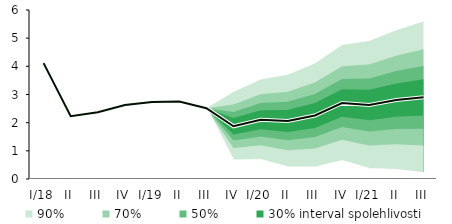
| Category | linka | Střed předpovědi |
|---|---|---|
| I/18 | 4.113 | 4.113 |
| II | 2.229 | 2.229 |
| III | 2.369 | 2.369 |
| IV | 2.63 | 2.63 |
| I/19 | 2.732 | 2.732 |
| II | 2.75 | 2.75 |
| III | 2.514 | 2.514 |
| IV | 1.872 | 1.872 |
| I/20 | 2.105 | 2.105 |
| II | 2.06 | 2.06 |
| III | 2.254 | 2.254 |
| IV | 2.699 | 2.699 |
| I/21 | 2.628 | 2.628 |
| II | 2.803 | 2.803 |
| III | 2.899 | 2.899 |